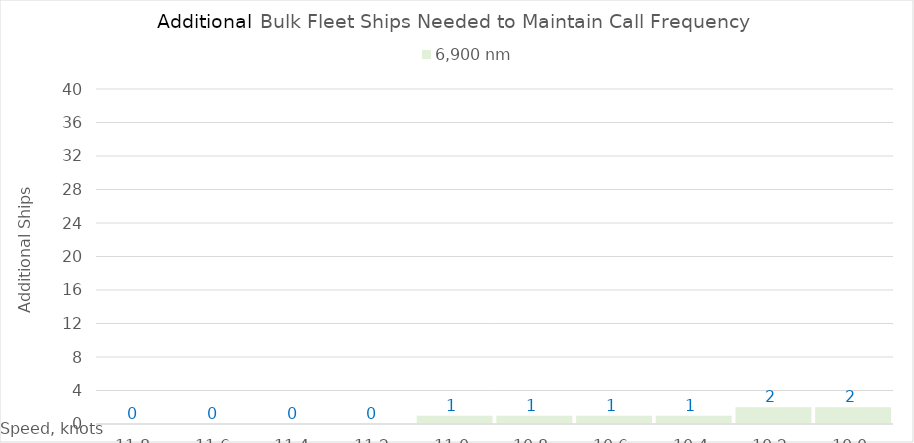
| Category | 6,900 |
|---|---|
| 11.8 | 0 |
| 11.600000000000001 | 0 |
| 11.400000000000002 | 0 |
| 11.200000000000003 | 0 |
| 11.000000000000004 | 1 |
| 10.800000000000004 | 1 |
| 10.600000000000005 | 1 |
| 10.400000000000006 | 1 |
| 10.200000000000006 | 2 |
| 10.000000000000007 | 2 |